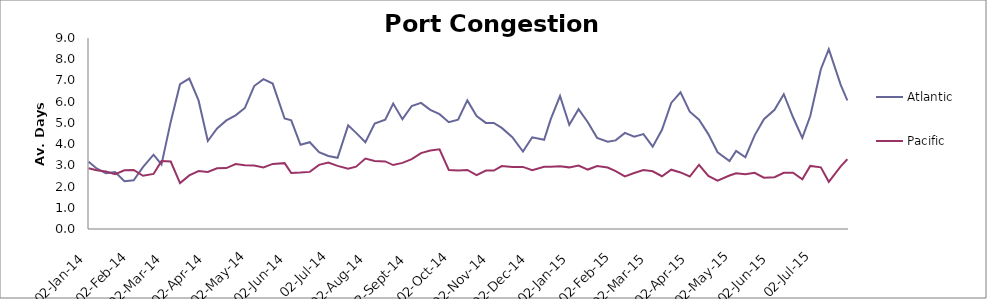
| Category | Atlantic  | Pacific |
|---|---|---|
| 2014-01-02 | 3.167 | 2.863 |
| 2014-01-08 | 2.854 | 2.767 |
| 2014-01-15 | 2.625 | 2.712 |
| 2014-01-22 | 2.688 | 2.582 |
| 2014-01-29 | 2.25 | 2.767 |
| 2014-02-05 | 2.292 | 2.781 |
| 2014-02-12 | 2.917 | 2.507 |
| 2014-02-20 | 3.5 | 2.596 |
| 2014-02-26 | 3.042 | 3.199 |
| 2014-03-05 | 5.059 | 3.178 |
| 2014-03-12 | 6.824 | 2.164 |
| 2014-03-19 | 7.088 | 2.527 |
| 2014-03-26 | 6.059 | 2.733 |
| 2014-04-02 | 4.147 | 2.692 |
| 2014-04-09 | 4.735 | 2.863 |
| 2014-04-16 | 5.118 | 2.87 |
| 2014-04-23 | 5.353 | 3.062 |
| 2014-04-30 | 5.706 | 3 |
| 2014-05-07 | 6.735 | 2.993 |
| 2014-05-14 | 7.059 | 2.904 |
| 2014-05-21 | 6.853 | 3.068 |
| 2014-05-30 | 5.206 | 3.103 |
| 2014-06-04 | 5.118 | 2.637 |
| 2014-06-11 | 3.971 | 2.658 |
| 2014-06-18 | 4.088 | 2.692 |
| 2014-06-25 | 3.618 | 3.021 |
| 2014-07-02 | 3.441 | 3.13 |
| 2014-07-09 | 3.353 | 2.973 |
| 2014-07-17 | 4.882 | 2.836 |
| 2014-07-23 | 4.529 | 2.938 |
| 2014-07-30 | 4.088 | 3.322 |
| 2014-08-06 | 4.971 | 3.205 |
| 2014-08-14 | 5.147 | 3.185 |
| 2014-08-20 | 5.912 | 3.014 |
| 2014-08-27 | 5.176 | 3.116 |
| 2014-09-03 | 5.794 | 3.295 |
| 2014-09-10 | 5.941 | 3.575 |
| 2014-09-17 | 5.618 | 3.699 |
| 2014-09-24 | 5.412 | 3.753 |
| 2014-10-01 | 5.029 | 2.781 |
| 2014-10-08 | 5.147 | 2.753 |
| 2014-10-15 | 6.059 | 2.785 |
| 2014-10-22 | 5.324 | 2.541 |
| 2014-10-29 | 5 | 2.753 |
| 2014-11-04 | 5 | 2.753 |
| 2014-11-10 | 4.765 | 2.966 |
| 2014-11-18 | 4.324 | 2.918 |
| 2014-11-26 | 3.647 | 2.925 |
| 2014-12-03 | 4.324 | 2.767 |
| 2014-12-12 | 4.206 | 2.932 |
| 2014-12-17 | 5.176 | 2.938 |
| 2014-12-24 | 6.265 | 2.952 |
| 2014-12-31 | 4.912 | 2.904 |
| 2015-01-07 | 5.647 | 2.993 |
| 2015-01-14 | 5.029 | 2.801 |
| 2015-01-21 | 4.294 | 2.966 |
| 2015-01-29 | 4.118 | 2.897 |
| 2015-02-04 | 4.176 | 2.726 |
| 2015-02-11 | 4.529 | 2.479 |
| 2015-02-18 | 4.353 | 2.637 |
| 2015-02-25 | 4.471 | 2.774 |
| 2015-03-04 | 3.882 | 2.719 |
| 2015-03-11 | 4.676 | 2.486 |
| 2015-03-18 | 5.941 | 2.795 |
| 2015-03-25 | 6.441 | 2.664 |
| 2015-04-01 | 5.529 | 2.473 |
| 2015-04-08 | 5.147 | 3.027 |
| 2015-04-15 | 4.471 | 2.5 |
| 2015-04-22 | 3.618 | 2.274 |
| 2015-05-01 | 3.206 | 2.521 |
| 2015-05-06 | 3.676 | 2.63 |
| 2015-05-13 | 3.382 | 2.575 |
| 2015-05-20 | 4.412 | 2.651 |
| 2015-05-27 | 5.176 | 2.418 |
| 2015-06-04 | 5.618 | 2.442 |
| 2015-06-11 | 6.353 | 2.645 |
| 2015-06-18 | 5.265 | 2.651 |
| 2015-06-25 | 4.294 | 2.342 |
| 2015-07-01 | 5.324 | 2.973 |
| 2015-07-09 | 7.529 | 2.904 |
| 2015-07-15 | 8.471 | 2.223 |
| 2015-07-24 | 6.794 | 2.952 |
| 2015-07-29 | 6.059 | 3.288 |